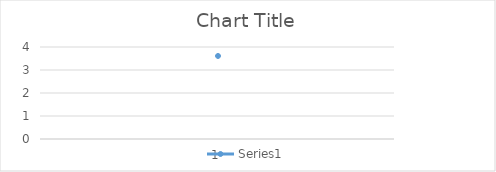
| Category | Series 0 |
|---|---|
| 0 | 3.61 |